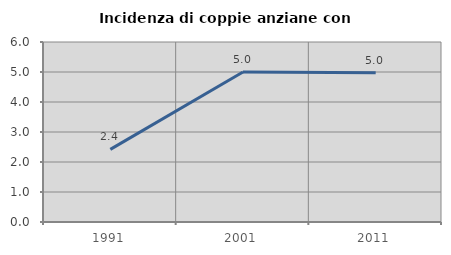
| Category | Incidenza di coppie anziane con figli |
|---|---|
| 1991.0 | 2.422 |
| 2001.0 | 5 |
| 2011.0 | 4.977 |